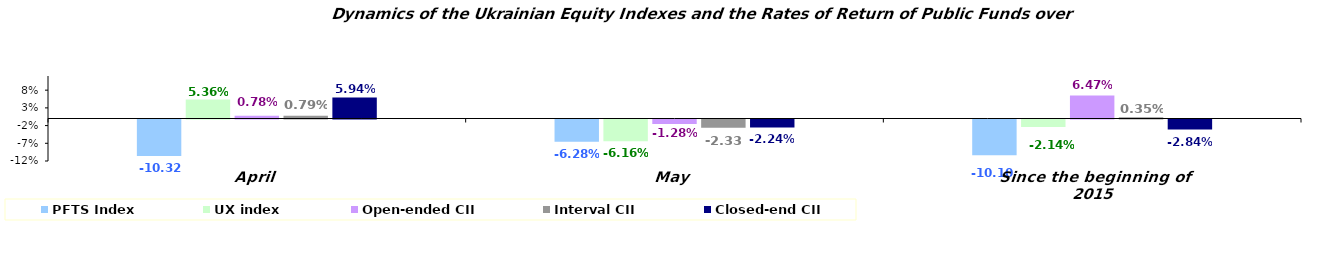
| Category | PFTS Index | UX index | Open-ended CII | Interval CII | Closed-end CII |
|---|---|---|---|---|---|
| April | -0.103 | 0.054 | 0.008 | 0.008 | 0.059 |
| May | -0.063 | -0.062 | -0.013 | -0.023 | -0.022 |
| Since the beginning of 2015 | -0.101 | -0.021 | 0.065 | 0.003 | -0.028 |